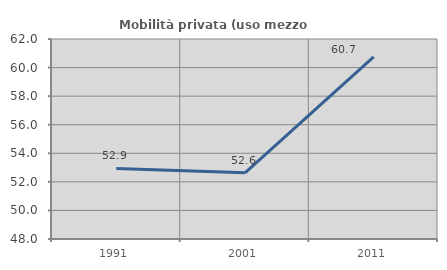
| Category | Mobilità privata (uso mezzo privato) |
|---|---|
| 1991.0 | 52.941 |
| 2001.0 | 52.632 |
| 2011.0 | 60.748 |